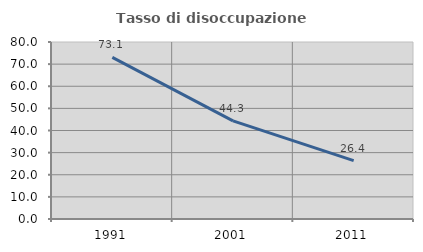
| Category | Tasso di disoccupazione giovanile  |
|---|---|
| 1991.0 | 73.066 |
| 2001.0 | 44.33 |
| 2011.0 | 26.415 |